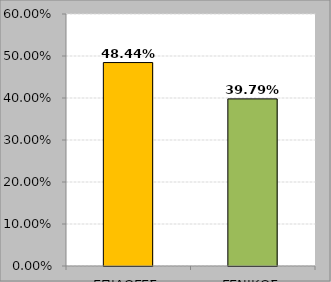
| Category | Series 0 |
|---|---|
| ΕΠΙΛΟΓΕΣ | 0.484 |
| ΓΕΝΙΚΟΣ | 0.398 |